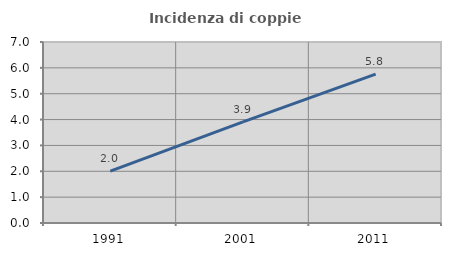
| Category | Incidenza di coppie miste |
|---|---|
| 1991.0 | 2.008 |
| 2001.0 | 3.912 |
| 2011.0 | 5.757 |